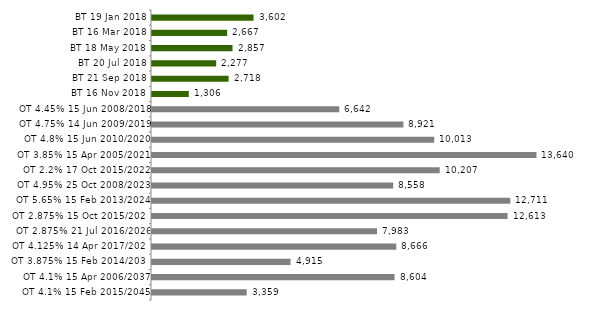
| Category | Series 0 |
|---|---|
| BT 19 Jan 2018 | 3602.458 |
| BT 16 Mar 2018 | 2666.751 |
| BT 18 May 2018 | 2857.044 |
| BT 20 Jul 2018 | 2276.606 |
| BT 21 Sep 2018 | 2717.708 |
| BT 16 Nov 2018 | 1306.301 |
| OT 4.45% 15 Jun 2008/2018 | 6642.44 |
| OT 4.75% 14 Jun 2009/2019 | 8920.58 |
| OT 4.8% 15 Jun 2010/2020 | 10012.658 |
| OT 3.85% 15 Apr 2005/2021 | 13639.958 |
| OT 2.2% 17 Oct 2015/2022 | 10207.462 |
| OT 4.95% 25 Oct 2008/2023 | 8557.734 |
| OT 5.65% 15 Feb 2013/2024 | 12711.355 |
| OT 2.875% 15 Oct 2015/2025 | 12613.263 |
| OT 2.875% 21 Jul 2016/2026 | 7982.982 |
| OT 4.125% 14 Apr 2017/2027 | 8665.841 |
| OT 3.875% 15 Feb 2014/2030 | 4914.902 |
| OT 4.1% 15 Apr 2006/2037 | 8604.325 |
| OT 4.1% 15 Feb 2015/2045 | 3358.684 |